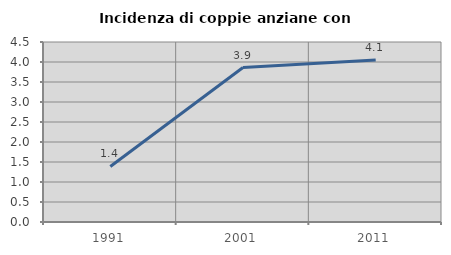
| Category | Incidenza di coppie anziane con figli |
|---|---|
| 1991.0 | 1.389 |
| 2001.0 | 3.862 |
| 2011.0 | 4.053 |